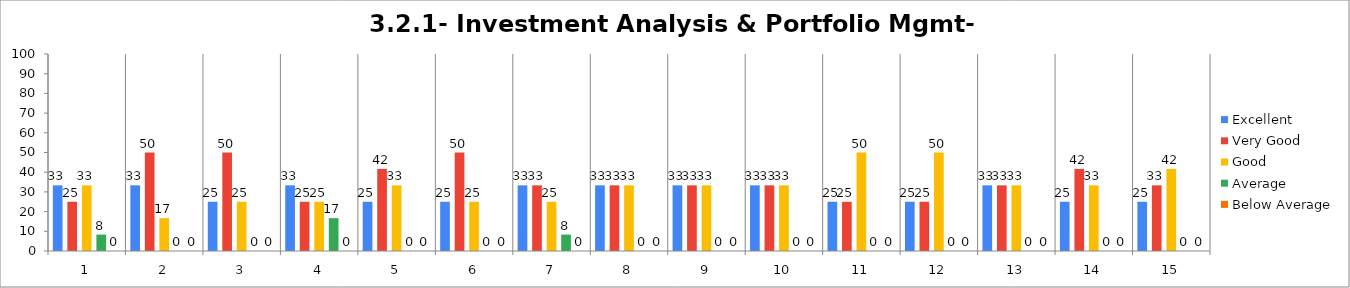
| Category | Excellent | Very Good | Good | Average | Below Average |
|---|---|---|---|---|---|
| 0 | 33.333 | 25 | 33.333 | 8.333 | 0 |
| 1 | 33.333 | 50 | 16.667 | 0 | 0 |
| 2 | 25 | 50 | 25 | 0 | 0 |
| 3 | 33.333 | 25 | 25 | 16.667 | 0 |
| 4 | 25 | 41.667 | 33.333 | 0 | 0 |
| 5 | 25 | 50 | 25 | 0 | 0 |
| 6 | 33.333 | 33.333 | 25 | 8.333 | 0 |
| 7 | 33.333 | 33.333 | 33.333 | 0 | 0 |
| 8 | 33.333 | 33.333 | 33.333 | 0 | 0 |
| 9 | 33.333 | 33.333 | 33.333 | 0 | 0 |
| 10 | 25 | 25 | 50 | 0 | 0 |
| 11 | 25 | 25 | 50 | 0 | 0 |
| 12 | 33.333 | 33.333 | 33.333 | 0 | 0 |
| 13 | 25 | 41.667 | 33.333 | 0 | 0 |
| 14 | 25 | 33.333 | 41.667 | 0 | 0 |